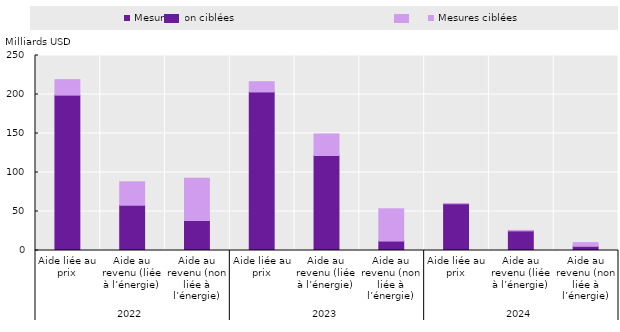
| Category | Mesures non ciblées | Mesures ciblées |
|---|---|---|
| 0 | 199.172 | 19.875 |
| 1 | 58.043 | 29.976 |
| 2 | 38.566 | 53.951 |
| 3 | 203.257 | 13.129 |
| 4 | 121.787 | 27.628 |
| 5 | 12.107 | 41.331 |
| 6 | 59.954 | 0.261 |
| 7 | 25.157 | 0.62 |
| 8 | 5.374 | 4.701 |